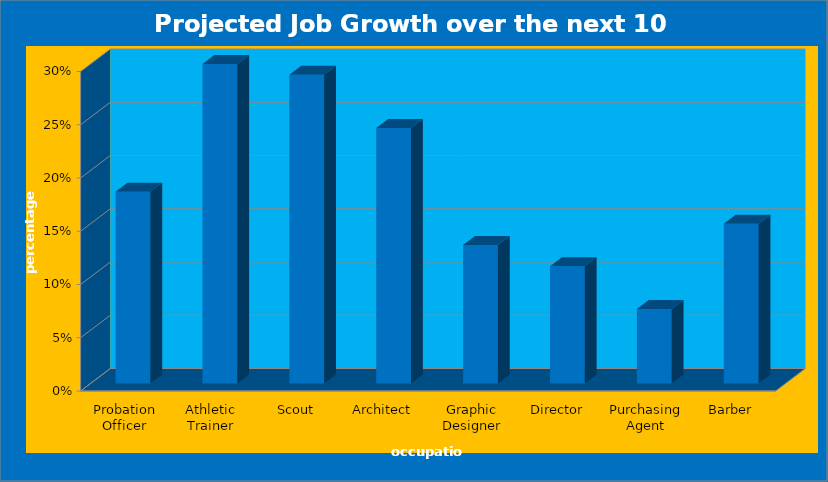
| Category | Projected Job Growth over the next 10 years Percentage Growth |
|---|---|
| Probation Officer | 0.18 |
| Athletic Trainer | 0.3 |
| Scout | 0.29 |
| Architect | 0.24 |
| Graphic Designer | 0.13 |
| Director | 0.11 |
| Purchasing Agent | 0.07 |
| Barber | 0.15 |